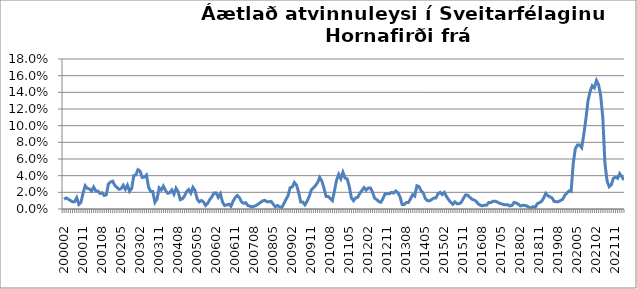
| Category | Series 0 |
|---|---|
| 200002 | 0.012 |
| 200003 | 0.013 |
| 200004 | 0.012 |
| 200005 | 0.01 |
| 200006 | 0.009 |
| 200007 | 0.009 |
| 200008 | 0.014 |
| 200009 | 0.006 |
| 200010 | 0.008 |
| 200011 | 0.019 |
| 200012 | 0.028 |
| 200101 | 0.025 |
| 200102 | 0.024 |
| 200103 | 0.022 |
| 200104 | 0.026 |
| 200105 | 0.022 |
| 200106 | 0.022 |
| 200107 | 0.019 |
| 200108 | 0.019 |
| 200109 | 0.016 |
| 200110 | 0.017 |
| 200111 | 0.03 |
| 200112 | 0.032 |
| 200201 | 0.033 |
| 200202 | 0.028 |
| 200203 | 0.026 |
| 200204 | 0.024 |
| 200205 | 0.024 |
| 200206 | 0.028 |
| 200207 | 0.024 |
| 200208 | 0.029 |
| 200209 | 0.021 |
| 200210 | 0.025 |
| 200211 | 0.04 |
| 200212 | 0.041 |
| 200301 | 0.047 |
| 200302 | 0.045 |
| 200303 | 0.038 |
| 200304 | 0.038 |
| 200305 | 0.041 |
| 200306 | 0.026 |
| 200307 | 0.021 |
| 200308 | 0.021 |
| 200309 | 0.008 |
| 200310 | 0.012 |
| 200311 | 0.025 |
| 200312 | 0.023 |
| 200401 | 0.027 |
| 200402 | 0.022 |
| 200403 | 0.019 |
| 200404 | 0.019 |
| 200405 | 0.023 |
| 200406 | 0.018 |
| 200407 | 0.025 |
| 200408 | 0.021 |
| 200409 | 0.011 |
| 200410 | 0.012 |
| 200411 | 0.016 |
| 200412 | 0.021 |
| 200501 | 0.023 |
| 200502 | 0.019 |
| 200503 | 0.026 |
| 200504 | 0.022 |
| 200505 | 0.012 |
| 200506 | 0.009 |
| 200507 | 0.01 |
| 200508 | 0.008 |
| 200509 | 0.004 |
| 200510 | 0.007 |
| 200511 | 0.011 |
| 200512 | 0.015 |
| 200601 | 0.019 |
| 200602 | 0.019 |
| 200603 | 0.014 |
| 200604 | 0.018 |
| 200605 | 0.008 |
| 200606 | 0.004 |
| 200607 | 0.005 |
| 200608 | 0.006 |
| 200609 | 0.003 |
| 200610 | 0.009 |
| 200611 | 0.014 |
| 200612 | 0.016 |
| 200701 | 0.014 |
| 200702 | 0.009 |
| 200703 | 0.007 |
| 200704 | 0.007 |
| 200705 | 0.004 |
| 200706 | 0.003 |
| 200707 | 0.003 |
| 200708 | 0.003 |
| 200709 | 0.004 |
| 200710 | 0.006 |
| 200711 | 0.008 |
| 200712 | 0.01 |
| 200801 | 0.01 |
| 200802 | 0.009 |
| 200803 | 0.009 |
| 200804 | 0.009 |
| 200805 | 0.006 |
| 200806 | 0.002 |
| 200807 | 0.004 |
| 200808 | 0.003 |
| 200809 | 0.002 |
| 200810 | 0.006 |
| 200811 | 0.011 |
| 200812 | 0.016 |
| 200901 | 0.026 |
| 200902 | 0.026 |
| 200903 | 0.032 |
| 200904 | 0.029 |
| 200905 | 0.02 |
| 200906 | 0.008 |
| 200907 | 0.008 |
| 200908 | 0.005 |
| 200909 | 0.009 |
| 200910 | 0.015 |
| 200911 | 0.023 |
| 200912 | 0.025 |
| 201001 | 0.028 |
| 201002 | 0.032 |
| 201003 | 0.038 |
| 201004 | 0.034 |
| 201005 | 0.025 |
| 201006 | 0.015 |
| 201007 | 0.015 |
| 201008 | 0.012 |
| 201009 | 0.01 |
| 201010 | 0.022 |
| 201011 | 0.035 |
| 201012 | 0.042 |
| 201101 | 0.036 |
| 201102 | 0.044 |
| 201103 | 0.037 |
| 201104 | 0.036 |
| 201105 | 0.027 |
| 201106 | 0.013 |
| 201107 | 0.01 |
| 201108 | 0.013 |
| 201109 | 0.014 |
| 201110 | 0.019 |
| 201111 | 0.022 |
| 201112 | 0.026 |
| 201201 | 0.023 |
| 201202 | 0.025 |
| 201203 | 0.025 |
| 201204 | 0.02 |
| 201205 | 0.013 |
| 201206 | 0.011 |
| 201207 | 0.009 |
| 201208 | 0.008 |
| 201209 | 0.013 |
| 201210 | 0.018 |
| 201211 | 0.018 |
| 201212 | 0.018 |
| 201301 | 0.02 |
| 201302 | 0.019 |
| 201303 | 0.022 |
| 201304 | 0.02 |
| 201305 | 0.015 |
| 201306 | 0.005 |
| 201307 | 0.005 |
| 201308 | 0.008 |
| 201309 | 0.008 |
| 201310 | 0.012 |
| 201311 | 0.017 |
| 201312 | 0.016 |
| 201401* | 0.028 |
| 201402 | 0.027 |
| 201403 | 0.022 |
| 201404 | 0.019 |
| 201405 | 0.013 |
| 201406 | 0.01 |
| 201407 | 0.01 |
| 201408 | 0.011 |
| 201409 | 0.013 |
| 201410 | 0.013 |
| 201411 | 0.018 |
| 201412 | 0.02 |
| 201501 | 0.017 |
| 201502 | 0.02 |
| 201503 | 0.015 |
| 201504 | 0.011 |
| 201505 | 0.008 |
| 201506 | 0.006 |
| 201507 | 0.009 |
| 201508 | 0.006 |
| 201509 | 0.006 |
| 201510 | 0.008 |
| 201511 | 0.013 |
| 201512 | 0.017 |
| 201601 | 0.017 |
| 201602 | 0.014 |
| 201603 | 0.012 |
| 201604 | 0.011 |
| 201605 | 0.009 |
| 201606 | 0.006 |
| 201607 | 0.005 |
| 201608 | 0.004 |
| 201609 | 0.005 |
| 201610 | 0.005 |
| 201611 | 0.008 |
| 201612 | 0.008 |
| 201701 | 0.009 |
| 201702 | 0.009 |
| 201703 | 0.009 |
| 201704 | 0.007 |
| 201705 | 0.006 |
| 201706 | 0.005 |
| 201707 | 0.005 |
| 201708 | 0.005 |
| 201709 | 0.004 |
| 201710 | 0.004 |
| 201711 | 0.008 |
| 201712 | 0.007 |
| 201801 | 0.006 |
| 201802 | 0.004 |
| 201803 | 0.004 |
| 201804 | 0.004 |
| 201805 | 0.004 |
| 201806 | 0.002 |
| 201807 | 0.001 |
| 201808 | 0.003 |
| 201809 | 0.002 |
| 201810 | 0.006 |
| 201811 | 0.008 |
| 201812 | 0.009 |
| 201901 | 0.013 |
| 201902 | 0.019 |
| 201903 | 0.016 |
| 201904 | 0.015 |
| 201905 | 0.013 |
| 201906 | 0.009 |
| 201907 | 0.009 |
| 201908 | 0.009 |
| 201909 | 0.01 |
| 201910 | 0.012 |
| 201911 | 0.016 |
| 201912 | 0.019 |
| 202001 | 0.022 |
| 202002 | 0.021 |
| 202003***  | 0.055 |
| 202004 | 0.072 |
| 202005 | 0.077 |
| 202006 | 0.077 |
| 202007 | 0.074 |
| 202008 | 0.089 |
| 202009 | 0.108 |
| 202010 | 0.13 |
| 202011 | 0.141 |
| 202012 | 0.148 |
| 202101 | 0.145 |
| 202102 | 0.154 |
| 202103 | 0.149 |
| 202104 | 0.136 |
| 202105 | 0.109 |
| 202106 | 0.055 |
| 202107 | 0.034 |
| 202108 | 0.027 |
| 202109 | 0.029 |
| 202110 | 0.037 |
| 202111 | 0.038 |
| 202112 | 0.037 |
| 202201 | 0.042 |
| 202202 | 0.039 |
| 202203 | 0.035 |